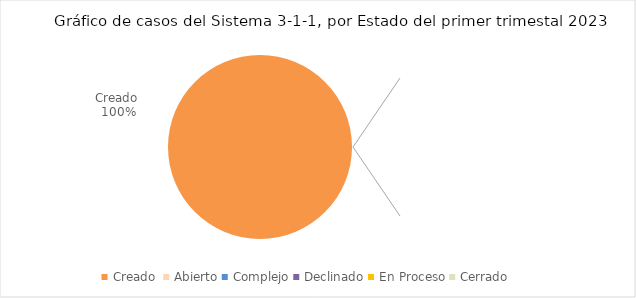
| Category | Series 0 |
|---|---|
| Creado  | 2 |
| Abierto | 0 |
| Complejo | 0 |
| Declinado | 0 |
| En Proceso | 0 |
| Cerrado  | 0 |